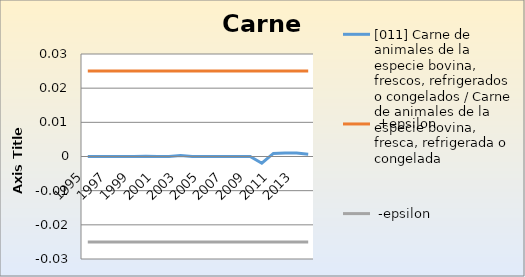
| Category | [011] Carne de animales de la especie bovina, frescos, refrigerados o congelados / Carne de animales de la especie bovina, fresca, refrigerada o congelada |  +epsilon |  -epsilon |
|---|---|---|---|
| 1995.0 | 0 | 0.025 | -0.025 |
| 1996.0 | 0 | 0.025 | -0.025 |
| 1997.0 | 0 | 0.025 | -0.025 |
| 1998.0 | 0 | 0.025 | -0.025 |
| 1999.0 | 0 | 0.025 | -0.025 |
| 2000.0 | 0 | 0.025 | -0.025 |
| 2001.0 | 0 | 0.025 | -0.025 |
| 2002.0 | 0 | 0.025 | -0.025 |
| 2003.0 | 0 | 0.025 | -0.025 |
| 2004.0 | 0 | 0.025 | -0.025 |
| 2005.0 | 0 | 0.025 | -0.025 |
| 2006.0 | 0 | 0.025 | -0.025 |
| 2007.0 | 0 | 0.025 | -0.025 |
| 2008.0 | 0 | 0.025 | -0.025 |
| 2009.0 | 0 | 0.025 | -0.025 |
| 2010.0 | -0.002 | 0.025 | -0.025 |
| 2011.0 | 0.001 | 0.025 | -0.025 |
| 2012.0 | 0.001 | 0.025 | -0.025 |
| 2013.0 | 0.001 | 0.025 | -0.025 |
| 2014.0 | 0.001 | 0.025 | -0.025 |